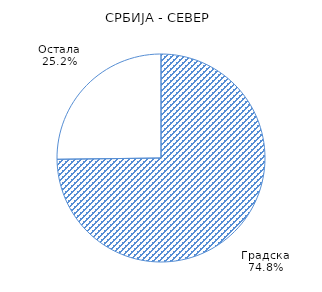
| Category | Series 0 |
|---|---|
| Градска | 74.8 |
| Остала | 25.2 |